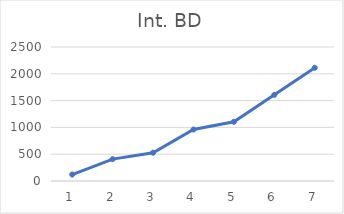
| Category | Int. BD |
|---|---|
| 0 | 120 |
| 1 | 408 |
| 2 | 528 |
| 3 | 960 |
| 4 | 1104 |
| 5 | 1608 |
| 6 | 2112 |